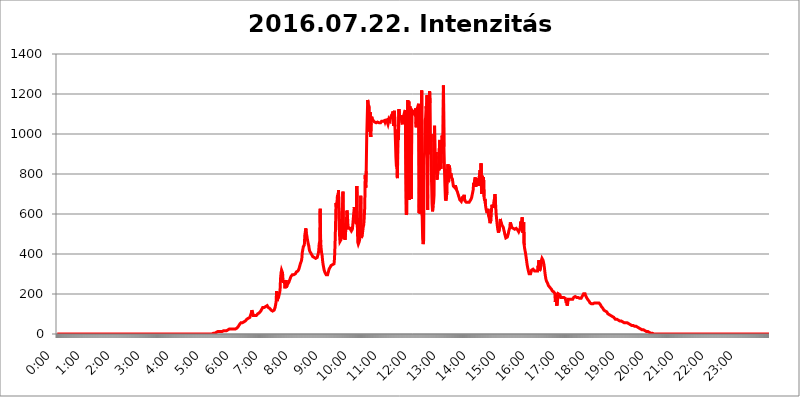
| Category | 2016.07.22. Intenzitás [W/m^2] |
|---|---|
| 0.0 | 0 |
| 0.0006944444444444445 | 0 |
| 0.001388888888888889 | 0 |
| 0.0020833333333333333 | 0 |
| 0.002777777777777778 | 0 |
| 0.003472222222222222 | 0 |
| 0.004166666666666667 | 0 |
| 0.004861111111111111 | 0 |
| 0.005555555555555556 | 0 |
| 0.0062499999999999995 | 0 |
| 0.006944444444444444 | 0 |
| 0.007638888888888889 | 0 |
| 0.008333333333333333 | 0 |
| 0.009027777777777779 | 0 |
| 0.009722222222222222 | 0 |
| 0.010416666666666666 | 0 |
| 0.011111111111111112 | 0 |
| 0.011805555555555555 | 0 |
| 0.012499999999999999 | 0 |
| 0.013194444444444444 | 0 |
| 0.013888888888888888 | 0 |
| 0.014583333333333332 | 0 |
| 0.015277777777777777 | 0 |
| 0.015972222222222224 | 0 |
| 0.016666666666666666 | 0 |
| 0.017361111111111112 | 0 |
| 0.018055555555555557 | 0 |
| 0.01875 | 0 |
| 0.019444444444444445 | 0 |
| 0.02013888888888889 | 0 |
| 0.020833333333333332 | 0 |
| 0.02152777777777778 | 0 |
| 0.022222222222222223 | 0 |
| 0.02291666666666667 | 0 |
| 0.02361111111111111 | 0 |
| 0.024305555555555556 | 0 |
| 0.024999999999999998 | 0 |
| 0.025694444444444447 | 0 |
| 0.02638888888888889 | 0 |
| 0.027083333333333334 | 0 |
| 0.027777777777777776 | 0 |
| 0.02847222222222222 | 0 |
| 0.029166666666666664 | 0 |
| 0.029861111111111113 | 0 |
| 0.030555555555555555 | 0 |
| 0.03125 | 0 |
| 0.03194444444444445 | 0 |
| 0.03263888888888889 | 0 |
| 0.03333333333333333 | 0 |
| 0.034027777777777775 | 0 |
| 0.034722222222222224 | 0 |
| 0.035416666666666666 | 0 |
| 0.036111111111111115 | 0 |
| 0.03680555555555556 | 0 |
| 0.0375 | 0 |
| 0.03819444444444444 | 0 |
| 0.03888888888888889 | 0 |
| 0.03958333333333333 | 0 |
| 0.04027777777777778 | 0 |
| 0.04097222222222222 | 0 |
| 0.041666666666666664 | 0 |
| 0.042361111111111106 | 0 |
| 0.04305555555555556 | 0 |
| 0.043750000000000004 | 0 |
| 0.044444444444444446 | 0 |
| 0.04513888888888889 | 0 |
| 0.04583333333333334 | 0 |
| 0.04652777777777778 | 0 |
| 0.04722222222222222 | 0 |
| 0.04791666666666666 | 0 |
| 0.04861111111111111 | 0 |
| 0.049305555555555554 | 0 |
| 0.049999999999999996 | 0 |
| 0.05069444444444445 | 0 |
| 0.051388888888888894 | 0 |
| 0.052083333333333336 | 0 |
| 0.05277777777777778 | 0 |
| 0.05347222222222222 | 0 |
| 0.05416666666666667 | 0 |
| 0.05486111111111111 | 0 |
| 0.05555555555555555 | 0 |
| 0.05625 | 0 |
| 0.05694444444444444 | 0 |
| 0.057638888888888885 | 0 |
| 0.05833333333333333 | 0 |
| 0.05902777777777778 | 0 |
| 0.059722222222222225 | 0 |
| 0.06041666666666667 | 0 |
| 0.061111111111111116 | 0 |
| 0.06180555555555556 | 0 |
| 0.0625 | 0 |
| 0.06319444444444444 | 0 |
| 0.06388888888888888 | 0 |
| 0.06458333333333334 | 0 |
| 0.06527777777777778 | 0 |
| 0.06597222222222222 | 0 |
| 0.06666666666666667 | 0 |
| 0.06736111111111111 | 0 |
| 0.06805555555555555 | 0 |
| 0.06874999999999999 | 0 |
| 0.06944444444444443 | 0 |
| 0.07013888888888889 | 0 |
| 0.07083333333333333 | 0 |
| 0.07152777777777779 | 0 |
| 0.07222222222222223 | 0 |
| 0.07291666666666667 | 0 |
| 0.07361111111111111 | 0 |
| 0.07430555555555556 | 0 |
| 0.075 | 0 |
| 0.07569444444444444 | 0 |
| 0.0763888888888889 | 0 |
| 0.07708333333333334 | 0 |
| 0.07777777777777778 | 0 |
| 0.07847222222222222 | 0 |
| 0.07916666666666666 | 0 |
| 0.0798611111111111 | 0 |
| 0.08055555555555556 | 0 |
| 0.08125 | 0 |
| 0.08194444444444444 | 0 |
| 0.08263888888888889 | 0 |
| 0.08333333333333333 | 0 |
| 0.08402777777777777 | 0 |
| 0.08472222222222221 | 0 |
| 0.08541666666666665 | 0 |
| 0.08611111111111112 | 0 |
| 0.08680555555555557 | 0 |
| 0.08750000000000001 | 0 |
| 0.08819444444444445 | 0 |
| 0.08888888888888889 | 0 |
| 0.08958333333333333 | 0 |
| 0.09027777777777778 | 0 |
| 0.09097222222222222 | 0 |
| 0.09166666666666667 | 0 |
| 0.09236111111111112 | 0 |
| 0.09305555555555556 | 0 |
| 0.09375 | 0 |
| 0.09444444444444444 | 0 |
| 0.09513888888888888 | 0 |
| 0.09583333333333333 | 0 |
| 0.09652777777777777 | 0 |
| 0.09722222222222222 | 0 |
| 0.09791666666666667 | 0 |
| 0.09861111111111111 | 0 |
| 0.09930555555555555 | 0 |
| 0.09999999999999999 | 0 |
| 0.10069444444444443 | 0 |
| 0.1013888888888889 | 0 |
| 0.10208333333333335 | 0 |
| 0.10277777777777779 | 0 |
| 0.10347222222222223 | 0 |
| 0.10416666666666667 | 0 |
| 0.10486111111111111 | 0 |
| 0.10555555555555556 | 0 |
| 0.10625 | 0 |
| 0.10694444444444444 | 0 |
| 0.1076388888888889 | 0 |
| 0.10833333333333334 | 0 |
| 0.10902777777777778 | 0 |
| 0.10972222222222222 | 0 |
| 0.1111111111111111 | 0 |
| 0.11180555555555556 | 0 |
| 0.11180555555555556 | 0 |
| 0.1125 | 0 |
| 0.11319444444444444 | 0 |
| 0.11388888888888889 | 0 |
| 0.11458333333333333 | 0 |
| 0.11527777777777777 | 0 |
| 0.11597222222222221 | 0 |
| 0.11666666666666665 | 0 |
| 0.1173611111111111 | 0 |
| 0.11805555555555557 | 0 |
| 0.11944444444444445 | 0 |
| 0.12013888888888889 | 0 |
| 0.12083333333333333 | 0 |
| 0.12152777777777778 | 0 |
| 0.12222222222222223 | 0 |
| 0.12291666666666667 | 0 |
| 0.12291666666666667 | 0 |
| 0.12361111111111112 | 0 |
| 0.12430555555555556 | 0 |
| 0.125 | 0 |
| 0.12569444444444444 | 0 |
| 0.12638888888888888 | 0 |
| 0.12708333333333333 | 0 |
| 0.16875 | 0 |
| 0.12847222222222224 | 0 |
| 0.12916666666666668 | 0 |
| 0.12986111111111112 | 0 |
| 0.13055555555555556 | 0 |
| 0.13125 | 0 |
| 0.13194444444444445 | 0 |
| 0.1326388888888889 | 0 |
| 0.13333333333333333 | 0 |
| 0.13402777777777777 | 0 |
| 0.13402777777777777 | 0 |
| 0.13472222222222222 | 0 |
| 0.13541666666666666 | 0 |
| 0.1361111111111111 | 0 |
| 0.13749999999999998 | 0 |
| 0.13819444444444443 | 0 |
| 0.1388888888888889 | 0 |
| 0.13958333333333334 | 0 |
| 0.14027777777777778 | 0 |
| 0.14097222222222222 | 0 |
| 0.14166666666666666 | 0 |
| 0.1423611111111111 | 0 |
| 0.14305555555555557 | 0 |
| 0.14375000000000002 | 0 |
| 0.14444444444444446 | 0 |
| 0.1451388888888889 | 0 |
| 0.1451388888888889 | 0 |
| 0.14652777777777778 | 0 |
| 0.14722222222222223 | 0 |
| 0.14791666666666667 | 0 |
| 0.1486111111111111 | 0 |
| 0.14930555555555555 | 0 |
| 0.15 | 0 |
| 0.15069444444444444 | 0 |
| 0.15138888888888888 | 0 |
| 0.15208333333333332 | 0 |
| 0.15277777777777776 | 0 |
| 0.15347222222222223 | 0 |
| 0.15416666666666667 | 0 |
| 0.15486111111111112 | 0 |
| 0.15555555555555556 | 0 |
| 0.15625 | 0 |
| 0.15694444444444444 | 0 |
| 0.15763888888888888 | 0 |
| 0.15833333333333333 | 0 |
| 0.15902777777777777 | 0 |
| 0.15972222222222224 | 0 |
| 0.16041666666666668 | 0 |
| 0.16111111111111112 | 0 |
| 0.16180555555555556 | 0 |
| 0.1625 | 0 |
| 0.16319444444444445 | 0 |
| 0.1638888888888889 | 0 |
| 0.16458333333333333 | 0 |
| 0.16527777777777777 | 0 |
| 0.16597222222222222 | 0 |
| 0.16666666666666666 | 0 |
| 0.1673611111111111 | 0 |
| 0.16805555555555554 | 0 |
| 0.16874999999999998 | 0 |
| 0.16944444444444443 | 0 |
| 0.17013888888888887 | 0 |
| 0.1708333333333333 | 0 |
| 0.17152777777777775 | 0 |
| 0.17222222222222225 | 0 |
| 0.1729166666666667 | 0 |
| 0.17361111111111113 | 0 |
| 0.17430555555555557 | 0 |
| 0.17500000000000002 | 0 |
| 0.17569444444444446 | 0 |
| 0.1763888888888889 | 0 |
| 0.17708333333333334 | 0 |
| 0.17777777777777778 | 0 |
| 0.17847222222222223 | 0 |
| 0.17916666666666667 | 0 |
| 0.1798611111111111 | 0 |
| 0.18055555555555555 | 0 |
| 0.18125 | 0 |
| 0.18194444444444444 | 0 |
| 0.1826388888888889 | 0 |
| 0.18333333333333335 | 0 |
| 0.1840277777777778 | 0 |
| 0.18472222222222223 | 0 |
| 0.18541666666666667 | 0 |
| 0.18611111111111112 | 0 |
| 0.18680555555555556 | 0 |
| 0.1875 | 0 |
| 0.18819444444444444 | 0 |
| 0.18888888888888888 | 0 |
| 0.18958333333333333 | 0 |
| 0.19027777777777777 | 0 |
| 0.1909722222222222 | 0 |
| 0.19166666666666665 | 0 |
| 0.19236111111111112 | 0 |
| 0.19305555555555554 | 0 |
| 0.19375 | 0 |
| 0.19444444444444445 | 0 |
| 0.1951388888888889 | 0 |
| 0.19583333333333333 | 0 |
| 0.19652777777777777 | 0 |
| 0.19722222222222222 | 0 |
| 0.19791666666666666 | 0 |
| 0.1986111111111111 | 0 |
| 0.19930555555555554 | 0 |
| 0.19999999999999998 | 0 |
| 0.20069444444444443 | 0 |
| 0.20138888888888887 | 0 |
| 0.2020833333333333 | 0 |
| 0.2027777777777778 | 0 |
| 0.2034722222222222 | 0 |
| 0.2041666666666667 | 0 |
| 0.20486111111111113 | 0 |
| 0.20555555555555557 | 0 |
| 0.20625000000000002 | 0 |
| 0.20694444444444446 | 0 |
| 0.2076388888888889 | 0 |
| 0.20833333333333334 | 0 |
| 0.20902777777777778 | 0 |
| 0.20972222222222223 | 0 |
| 0.21041666666666667 | 0 |
| 0.2111111111111111 | 0 |
| 0.21180555555555555 | 0 |
| 0.2125 | 0 |
| 0.21319444444444444 | 0 |
| 0.2138888888888889 | 0 |
| 0.21458333333333335 | 0 |
| 0.2152777777777778 | 0 |
| 0.21597222222222223 | 0 |
| 0.21666666666666667 | 0 |
| 0.21736111111111112 | 0 |
| 0.21805555555555556 | 3.525 |
| 0.21875 | 3.525 |
| 0.21944444444444444 | 3.525 |
| 0.22013888888888888 | 3.525 |
| 0.22083333333333333 | 3.525 |
| 0.22152777777777777 | 3.525 |
| 0.2222222222222222 | 7.887 |
| 0.22291666666666665 | 7.887 |
| 0.2236111111111111 | 7.887 |
| 0.22430555555555556 | 7.887 |
| 0.225 | 12.257 |
| 0.22569444444444445 | 12.257 |
| 0.2263888888888889 | 12.257 |
| 0.22708333333333333 | 12.257 |
| 0.22777777777777777 | 12.257 |
| 0.22847222222222222 | 12.257 |
| 0.22916666666666666 | 12.257 |
| 0.2298611111111111 | 12.257 |
| 0.23055555555555554 | 12.257 |
| 0.23124999999999998 | 12.257 |
| 0.23194444444444443 | 16.636 |
| 0.23263888888888887 | 16.636 |
| 0.2333333333333333 | 16.636 |
| 0.2340277777777778 | 16.636 |
| 0.2347222222222222 | 16.636 |
| 0.2354166666666667 | 16.636 |
| 0.23611111111111113 | 16.636 |
| 0.23680555555555557 | 16.636 |
| 0.23750000000000002 | 16.636 |
| 0.23819444444444446 | 21.024 |
| 0.2388888888888889 | 21.024 |
| 0.23958333333333334 | 21.024 |
| 0.24027777777777778 | 21.024 |
| 0.24097222222222223 | 25.419 |
| 0.24166666666666667 | 25.419 |
| 0.2423611111111111 | 25.419 |
| 0.24305555555555555 | 29.823 |
| 0.24375 | 25.419 |
| 0.24444444444444446 | 25.419 |
| 0.24513888888888888 | 25.419 |
| 0.24583333333333335 | 25.419 |
| 0.2465277777777778 | 25.419 |
| 0.24722222222222223 | 25.419 |
| 0.24791666666666667 | 25.419 |
| 0.24861111111111112 | 25.419 |
| 0.24930555555555556 | 25.419 |
| 0.25 | 25.419 |
| 0.25069444444444444 | 25.419 |
| 0.2513888888888889 | 25.419 |
| 0.2520833333333333 | 29.823 |
| 0.25277777777777777 | 29.823 |
| 0.2534722222222222 | 34.234 |
| 0.25416666666666665 | 38.653 |
| 0.2548611111111111 | 43.079 |
| 0.2555555555555556 | 47.511 |
| 0.25625000000000003 | 47.511 |
| 0.2569444444444445 | 51.951 |
| 0.2576388888888889 | 56.398 |
| 0.25833333333333336 | 56.398 |
| 0.2590277777777778 | 60.85 |
| 0.25972222222222224 | 56.398 |
| 0.2604166666666667 | 60.85 |
| 0.2611111111111111 | 60.85 |
| 0.26180555555555557 | 60.85 |
| 0.2625 | 60.85 |
| 0.26319444444444445 | 60.85 |
| 0.2638888888888889 | 65.31 |
| 0.26458333333333334 | 65.31 |
| 0.2652777777777778 | 69.775 |
| 0.2659722222222222 | 74.246 |
| 0.26666666666666666 | 74.246 |
| 0.2673611111111111 | 78.722 |
| 0.26805555555555555 | 78.722 |
| 0.26875 | 78.722 |
| 0.26944444444444443 | 83.205 |
| 0.2701388888888889 | 83.205 |
| 0.2708333333333333 | 83.205 |
| 0.27152777777777776 | 87.692 |
| 0.2722222222222222 | 105.69 |
| 0.27291666666666664 | 119.235 |
| 0.2736111111111111 | 114.716 |
| 0.2743055555555555 | 101.184 |
| 0.27499999999999997 | 92.184 |
| 0.27569444444444446 | 87.692 |
| 0.27638888888888885 | 92.184 |
| 0.27708333333333335 | 92.184 |
| 0.2777777777777778 | 92.184 |
| 0.27847222222222223 | 92.184 |
| 0.2791666666666667 | 92.184 |
| 0.2798611111111111 | 92.184 |
| 0.28055555555555556 | 96.682 |
| 0.28125 | 101.184 |
| 0.28194444444444444 | 101.184 |
| 0.2826388888888889 | 101.184 |
| 0.2833333333333333 | 105.69 |
| 0.28402777777777777 | 110.201 |
| 0.2847222222222222 | 110.201 |
| 0.28541666666666665 | 114.716 |
| 0.28611111111111115 | 119.235 |
| 0.28680555555555554 | 123.758 |
| 0.28750000000000003 | 128.284 |
| 0.2881944444444445 | 132.814 |
| 0.2888888888888889 | 132.814 |
| 0.28958333333333336 | 132.814 |
| 0.2902777777777778 | 132.814 |
| 0.29097222222222224 | 132.814 |
| 0.2916666666666667 | 132.814 |
| 0.2923611111111111 | 137.347 |
| 0.29305555555555557 | 137.347 |
| 0.29375 | 141.884 |
| 0.29444444444444445 | 141.884 |
| 0.2951388888888889 | 137.347 |
| 0.29583333333333334 | 132.814 |
| 0.2965277777777778 | 132.814 |
| 0.2972222222222222 | 128.284 |
| 0.29791666666666666 | 128.284 |
| 0.2986111111111111 | 128.284 |
| 0.29930555555555555 | 123.758 |
| 0.3 | 119.235 |
| 0.30069444444444443 | 114.716 |
| 0.3013888888888889 | 114.716 |
| 0.3020833333333333 | 114.716 |
| 0.30277777777777776 | 114.716 |
| 0.3034722222222222 | 114.716 |
| 0.30416666666666664 | 119.235 |
| 0.3048611111111111 | 123.758 |
| 0.3055555555555555 | 132.814 |
| 0.30624999999999997 | 146.423 |
| 0.3069444444444444 | 160.056 |
| 0.3076388888888889 | 214.746 |
| 0.30833333333333335 | 164.605 |
| 0.3090277777777778 | 173.709 |
| 0.30972222222222223 | 169.156 |
| 0.3104166666666667 | 182.82 |
| 0.3111111111111111 | 196.497 |
| 0.31180555555555556 | 205.62 |
| 0.3125 | 219.309 |
| 0.31319444444444444 | 278.603 |
| 0.3138888888888889 | 305.898 |
| 0.3145833333333333 | 319.517 |
| 0.31527777777777777 | 314.98 |
| 0.3159722222222222 | 305.898 |
| 0.31666666666666665 | 269.49 |
| 0.31736111111111115 | 255.813 |
| 0.31805555555555554 | 269.49 |
| 0.31875000000000003 | 255.813 |
| 0.3194444444444445 | 228.436 |
| 0.3201388888888889 | 223.873 |
| 0.32083333333333336 | 269.49 |
| 0.3215277777777778 | 233 |
| 0.32222222222222224 | 242.127 |
| 0.3229166666666667 | 246.689 |
| 0.3236111111111111 | 251.251 |
| 0.32430555555555557 | 255.813 |
| 0.325 | 260.373 |
| 0.32569444444444445 | 264.932 |
| 0.3263888888888889 | 274.047 |
| 0.32708333333333334 | 278.603 |
| 0.3277777777777778 | 287.709 |
| 0.3284722222222222 | 292.259 |
| 0.32916666666666666 | 292.259 |
| 0.3298611111111111 | 296.808 |
| 0.33055555555555555 | 296.808 |
| 0.33125 | 296.808 |
| 0.33194444444444443 | 296.808 |
| 0.3326388888888889 | 296.808 |
| 0.3333333333333333 | 296.808 |
| 0.3340277777777778 | 301.354 |
| 0.3347222222222222 | 305.898 |
| 0.3354166666666667 | 310.44 |
| 0.3361111111111111 | 314.98 |
| 0.3368055555555556 | 314.98 |
| 0.33749999999999997 | 314.98 |
| 0.33819444444444446 | 319.517 |
| 0.33888888888888885 | 324.052 |
| 0.33958333333333335 | 333.113 |
| 0.34027777777777773 | 337.639 |
| 0.34097222222222223 | 351.198 |
| 0.3416666666666666 | 355.712 |
| 0.3423611111111111 | 364.728 |
| 0.3430555555555555 | 378.224 |
| 0.34375 | 409.574 |
| 0.3444444444444445 | 422.943 |
| 0.3451388888888889 | 436.27 |
| 0.3458333333333334 | 440.702 |
| 0.34652777777777777 | 445.129 |
| 0.34722222222222227 | 493.475 |
| 0.34791666666666665 | 510.885 |
| 0.34861111111111115 | 528.2 |
| 0.34930555555555554 | 502.192 |
| 0.35000000000000003 | 493.475 |
| 0.3506944444444444 | 475.972 |
| 0.3513888888888889 | 462.786 |
| 0.3520833333333333 | 449.551 |
| 0.3527777777777778 | 440.702 |
| 0.3534722222222222 | 422.943 |
| 0.3541666666666667 | 414.035 |
| 0.3548611111111111 | 409.574 |
| 0.35555555555555557 | 405.108 |
| 0.35625 | 400.638 |
| 0.35694444444444445 | 396.164 |
| 0.3576388888888889 | 391.685 |
| 0.35833333333333334 | 387.202 |
| 0.3590277777777778 | 387.202 |
| 0.3597222222222222 | 387.202 |
| 0.36041666666666666 | 382.715 |
| 0.3611111111111111 | 387.202 |
| 0.36180555555555555 | 378.224 |
| 0.3625 | 378.224 |
| 0.36319444444444443 | 378.224 |
| 0.3638888888888889 | 378.224 |
| 0.3645833333333333 | 382.715 |
| 0.3652777777777778 | 387.202 |
| 0.3659722222222222 | 400.638 |
| 0.3666666666666667 | 414.035 |
| 0.3673611111111111 | 449.551 |
| 0.3680555555555556 | 462.786 |
| 0.36874999999999997 | 625.784 |
| 0.36944444444444446 | 458.38 |
| 0.37013888888888885 | 427.39 |
| 0.37083333333333335 | 405.108 |
| 0.37152777777777773 | 391.685 |
| 0.37222222222222223 | 364.728 |
| 0.3729166666666666 | 346.682 |
| 0.3736111111111111 | 333.113 |
| 0.3743055555555555 | 319.517 |
| 0.375 | 314.98 |
| 0.3756944444444445 | 305.898 |
| 0.3763888888888889 | 301.354 |
| 0.3770833333333334 | 296.808 |
| 0.37777777777777777 | 292.259 |
| 0.37847222222222227 | 292.259 |
| 0.37916666666666665 | 296.808 |
| 0.37986111111111115 | 305.898 |
| 0.38055555555555554 | 314.98 |
| 0.38125000000000003 | 324.052 |
| 0.3819444444444444 | 328.584 |
| 0.3826388888888889 | 333.113 |
| 0.3833333333333333 | 337.639 |
| 0.3840277777777778 | 342.162 |
| 0.3847222222222222 | 346.682 |
| 0.3854166666666667 | 346.682 |
| 0.3861111111111111 | 346.682 |
| 0.38680555555555557 | 342.162 |
| 0.3875 | 342.162 |
| 0.38819444444444445 | 351.198 |
| 0.3888888888888889 | 378.224 |
| 0.38958333333333334 | 445.129 |
| 0.3902777777777778 | 536.82 |
| 0.3909722222222222 | 654.791 |
| 0.39166666666666666 | 629.948 |
| 0.3923611111111111 | 658.909 |
| 0.39305555555555555 | 695.666 |
| 0.39375 | 654.791 |
| 0.39444444444444443 | 719.877 |
| 0.3951388888888889 | 715.858 |
| 0.3958333333333333 | 497.836 |
| 0.3965277777777778 | 462.786 |
| 0.3972222222222222 | 462.786 |
| 0.3979166666666667 | 471.582 |
| 0.3986111111111111 | 489.108 |
| 0.3993055555555556 | 536.82 |
| 0.39999999999999997 | 625.784 |
| 0.40069444444444446 | 711.832 |
| 0.40138888888888885 | 506.542 |
| 0.40208333333333335 | 475.972 |
| 0.40277777777777773 | 553.986 |
| 0.40347222222222223 | 471.582 |
| 0.4041666666666666 | 497.836 |
| 0.4048611111111111 | 528.2 |
| 0.4055555555555555 | 558.261 |
| 0.40625 | 617.436 |
| 0.4069444444444445 | 596.45 |
| 0.4076388888888889 | 549.704 |
| 0.4083333333333334 | 528.2 |
| 0.40902777777777777 | 532.513 |
| 0.40972222222222227 | 532.513 |
| 0.41041666666666665 | 528.2 |
| 0.41111111111111115 | 523.88 |
| 0.41180555555555554 | 528.2 |
| 0.41250000000000003 | 515.223 |
| 0.4131944444444444 | 510.885 |
| 0.4138888888888889 | 523.88 |
| 0.4145833333333333 | 549.704 |
| 0.4152777777777778 | 553.986 |
| 0.4159722222222222 | 609.062 |
| 0.4166666666666667 | 634.105 |
| 0.4173611111111111 | 592.233 |
| 0.41805555555555557 | 634.105 |
| 0.41875 | 558.261 |
| 0.41944444444444445 | 549.704 |
| 0.4201388888888889 | 739.877 |
| 0.42083333333333334 | 545.416 |
| 0.4215277777777778 | 458.38 |
| 0.4222222222222222 | 449.551 |
| 0.42291666666666666 | 445.129 |
| 0.4236111111111111 | 462.786 |
| 0.42430555555555555 | 475.972 |
| 0.425 | 549.704 |
| 0.42569444444444443 | 691.608 |
| 0.4263888888888889 | 480.356 |
| 0.4270833333333333 | 475.972 |
| 0.4277777777777778 | 493.475 |
| 0.4284722222222222 | 515.223 |
| 0.4291666666666667 | 536.82 |
| 0.4298611111111111 | 545.416 |
| 0.4305555555555556 | 579.542 |
| 0.43124999999999997 | 634.105 |
| 0.43194444444444446 | 795.074 |
| 0.43263888888888885 | 731.896 |
| 0.43333333333333335 | 814.519 |
| 0.43402777777777773 | 981.244 |
| 0.43472222222222223 | 984.98 |
| 0.4354166666666666 | 1170.358 |
| 0.4361111111111111 | 1150.946 |
| 0.4368055555555555 | 1143.232 |
| 0.4375 | 1135.543 |
| 0.4381944444444445 | 1011.118 |
| 0.4388888888888889 | 1108.816 |
| 0.4395833333333334 | 984.98 |
| 0.44027777777777777 | 1052.255 |
| 0.44097222222222227 | 1086.097 |
| 0.44166666666666665 | 1078.555 |
| 0.44236111111111115 | 1074.789 |
| 0.44305555555555554 | 1067.267 |
| 0.44375000000000003 | 1071.027 |
| 0.4444444444444444 | 1063.51 |
| 0.4451388888888889 | 1059.756 |
| 0.4458333333333333 | 1059.756 |
| 0.4465277777777778 | 1059.756 |
| 0.4472222222222222 | 1056.004 |
| 0.4479166666666667 | 1059.756 |
| 0.4486111111111111 | 1059.756 |
| 0.44930555555555557 | 1059.756 |
| 0.45 | 1063.51 |
| 0.45069444444444445 | 1059.756 |
| 0.4513888888888889 | 1056.004 |
| 0.45208333333333334 | 1059.756 |
| 0.4527777777777778 | 1059.756 |
| 0.4534722222222222 | 1056.004 |
| 0.45416666666666666 | 1059.756 |
| 0.4548611111111111 | 1063.51 |
| 0.45555555555555555 | 1067.267 |
| 0.45625 | 1067.267 |
| 0.45694444444444443 | 1063.51 |
| 0.4576388888888889 | 1063.51 |
| 0.4583333333333333 | 1067.267 |
| 0.4590277777777778 | 1067.267 |
| 0.4597222222222222 | 1059.756 |
| 0.4604166666666667 | 1067.267 |
| 0.4611111111111111 | 1063.51 |
| 0.4618055555555556 | 1071.027 |
| 0.46249999999999997 | 1071.027 |
| 0.46319444444444446 | 1056.004 |
| 0.46388888888888885 | 1048.508 |
| 0.46458333333333335 | 1059.756 |
| 0.46527777777777773 | 1074.789 |
| 0.46597222222222223 | 1071.027 |
| 0.4666666666666666 | 1067.267 |
| 0.4673611111111111 | 1078.555 |
| 0.4680555555555555 | 1086.097 |
| 0.46875 | 1093.653 |
| 0.4694444444444445 | 1093.653 |
| 0.4701388888888889 | 1101.226 |
| 0.4708333333333334 | 1112.618 |
| 0.47152777777777777 | 1041.019 |
| 0.47222222222222227 | 1097.437 |
| 0.47291666666666665 | 1116.426 |
| 0.47361111111111115 | 1037.277 |
| 0.47430555555555554 | 966.295 |
| 0.47500000000000003 | 883.516 |
| 0.4756944444444444 | 837.682 |
| 0.4763888888888889 | 860.676 |
| 0.4770833333333333 | 779.42 |
| 0.4777777777777778 | 1022.323 |
| 0.4784722222222222 | 970.034 |
| 0.4791666666666667 | 1124.056 |
| 0.4798611111111111 | 1101.226 |
| 0.48055555555555557 | 1071.027 |
| 0.48125 | 1086.097 |
| 0.48194444444444445 | 1093.653 |
| 0.4826388888888889 | 1093.653 |
| 0.48333333333333334 | 1089.873 |
| 0.4840277777777778 | 1048.508 |
| 0.4847222222222222 | 1086.097 |
| 0.48541666666666666 | 1086.097 |
| 0.4861111111111111 | 1093.653 |
| 0.48680555555555555 | 1105.019 |
| 0.4875 | 1108.816 |
| 0.48819444444444443 | 1120.238 |
| 0.4888888888888889 | 1124.056 |
| 0.4895833333333333 | 596.45 |
| 0.4902777777777778 | 604.864 |
| 0.4909722222222222 | 1059.756 |
| 0.4916666666666667 | 1170.358 |
| 0.4923611111111111 | 818.392 |
| 0.4930555555555556 | 1162.571 |
| 0.49374999999999997 | 671.22 |
| 0.49444444444444446 | 1139.384 |
| 0.49513888888888885 | 1135.543 |
| 0.49583333333333335 | 898.668 |
| 0.49652777777777773 | 675.311 |
| 0.49722222222222223 | 1097.437 |
| 0.4979166666666666 | 1116.426 |
| 0.4986111111111111 | 1120.238 |
| 0.4993055555555555 | 1108.816 |
| 0.5 | 1105.019 |
| 0.5006944444444444 | 1101.226 |
| 0.5013888888888889 | 1108.816 |
| 0.5020833333333333 | 1112.618 |
| 0.5027777777777778 | 1127.879 |
| 0.5034722222222222 | 1033.537 |
| 0.5041666666666667 | 1116.426 |
| 0.5048611111111111 | 1127.879 |
| 0.5055555555555555 | 1135.543 |
| 0.50625 | 1139.384 |
| 0.5069444444444444 | 1150.946 |
| 0.5076388888888889 | 604.864 |
| 0.5083333333333333 | 833.834 |
| 0.5090277777777777 | 600.661 |
| 0.5097222222222222 | 621.613 |
| 0.5104166666666666 | 604.864 |
| 0.5111111111111112 | 1217.812 |
| 0.5118055555555555 | 592.233 |
| 0.5125000000000001 | 475.972 |
| 0.5131944444444444 | 449.551 |
| 0.513888888888889 | 467.187 |
| 0.5145833333333333 | 875.918 |
| 0.5152777777777778 | 909.996 |
| 0.5159722222222222 | 1067.267 |
| 0.5166666666666667 | 1082.324 |
| 0.517361111111111 | 1139.384 |
| 0.5180555555555556 | 1116.426 |
| 0.5187499999999999 | 1193.918 |
| 0.5194444444444445 | 621.613 |
| 0.5201388888888888 | 1162.571 |
| 0.5208333333333334 | 1158.689 |
| 0.5215277777777778 | 1059.756 |
| 0.5222222222222223 | 1213.804 |
| 0.5229166666666667 | 1154.814 |
| 0.5236111111111111 | 898.668 |
| 0.5243055555555556 | 999.916 |
| 0.525 | 759.723 |
| 0.5256944444444445 | 650.667 |
| 0.5263888888888889 | 613.252 |
| 0.5270833333333333 | 642.4 |
| 0.5277777777777778 | 654.791 |
| 0.5284722222222222 | 695.666 |
| 0.5291666666666667 | 1041.019 |
| 0.5298611111111111 | 856.855 |
| 0.5305555555555556 | 798.974 |
| 0.53125 | 909.996 |
| 0.5319444444444444 | 810.641 |
| 0.5326388888888889 | 771.559 |
| 0.5333333333333333 | 775.492 |
| 0.5340277777777778 | 775.492 |
| 0.5347222222222222 | 849.199 |
| 0.5354166666666667 | 818.392 |
| 0.5361111111111111 | 962.555 |
| 0.5368055555555555 | 970.034 |
| 0.5375 | 845.365 |
| 0.5381944444444444 | 826.123 |
| 0.5388888888888889 | 917.534 |
| 0.5395833333333333 | 992.448 |
| 0.5402777777777777 | 977.508 |
| 0.5409722222222222 | 917.534 |
| 0.5416666666666666 | 1242.089 |
| 0.5423611111111112 | 936.33 |
| 0.5430555555555555 | 829.981 |
| 0.5437500000000001 | 739.877 |
| 0.5444444444444444 | 675.311 |
| 0.545138888888889 | 667.123 |
| 0.5458333333333333 | 671.22 |
| 0.5465277777777778 | 707.8 |
| 0.5472222222222222 | 806.757 |
| 0.5479166666666667 | 849.199 |
| 0.548611111111111 | 759.723 |
| 0.5493055555555556 | 767.62 |
| 0.5499999999999999 | 841.526 |
| 0.5506944444444445 | 818.392 |
| 0.5513888888888888 | 795.074 |
| 0.5520833333333334 | 802.868 |
| 0.5527777777777778 | 783.342 |
| 0.5534722222222223 | 787.258 |
| 0.5541666666666667 | 775.492 |
| 0.5548611111111111 | 775.492 |
| 0.5555555555555556 | 739.877 |
| 0.55625 | 743.859 |
| 0.5569444444444445 | 735.89 |
| 0.5576388888888889 | 731.896 |
| 0.5583333333333333 | 743.859 |
| 0.5590277777777778 | 743.859 |
| 0.5597222222222222 | 723.889 |
| 0.5604166666666667 | 719.877 |
| 0.5611111111111111 | 711.832 |
| 0.5618055555555556 | 707.8 |
| 0.5625 | 695.666 |
| 0.5631944444444444 | 687.544 |
| 0.5638888888888889 | 679.395 |
| 0.5645833333333333 | 671.22 |
| 0.5652777777777778 | 667.123 |
| 0.5659722222222222 | 667.123 |
| 0.5666666666666667 | 663.019 |
| 0.5673611111111111 | 671.22 |
| 0.5680555555555555 | 671.22 |
| 0.56875 | 687.544 |
| 0.5694444444444444 | 675.311 |
| 0.5701388888888889 | 671.22 |
| 0.5708333333333333 | 695.666 |
| 0.5715277777777777 | 667.123 |
| 0.5722222222222222 | 667.123 |
| 0.5729166666666666 | 663.019 |
| 0.5736111111111112 | 658.909 |
| 0.5743055555555555 | 658.909 |
| 0.5750000000000001 | 658.909 |
| 0.5756944444444444 | 658.909 |
| 0.576388888888889 | 658.909 |
| 0.5770833333333333 | 654.791 |
| 0.5777777777777778 | 658.909 |
| 0.5784722222222222 | 663.019 |
| 0.5791666666666667 | 667.123 |
| 0.579861111111111 | 671.22 |
| 0.5805555555555556 | 675.311 |
| 0.5812499999999999 | 683.473 |
| 0.5819444444444445 | 695.666 |
| 0.5826388888888888 | 707.8 |
| 0.5833333333333334 | 719.877 |
| 0.5840277777777778 | 755.766 |
| 0.5847222222222223 | 747.834 |
| 0.5854166666666667 | 767.62 |
| 0.5861111111111111 | 783.342 |
| 0.5868055555555556 | 735.89 |
| 0.5875 | 779.42 |
| 0.5881944444444445 | 747.834 |
| 0.5888888888888889 | 743.859 |
| 0.5895833333333333 | 743.859 |
| 0.5902777777777778 | 751.803 |
| 0.5909722222222222 | 739.877 |
| 0.5916666666666667 | 743.859 |
| 0.5923611111111111 | 802.868 |
| 0.5930555555555556 | 818.392 |
| 0.59375 | 739.877 |
| 0.5944444444444444 | 853.029 |
| 0.5951388888888889 | 699.717 |
| 0.5958333333333333 | 747.834 |
| 0.5965277777777778 | 791.169 |
| 0.5972222222222222 | 731.896 |
| 0.5979166666666667 | 783.342 |
| 0.5986111111111111 | 687.544 |
| 0.5993055555555555 | 667.123 |
| 0.6 | 675.311 |
| 0.6006944444444444 | 642.4 |
| 0.6013888888888889 | 625.784 |
| 0.6020833333333333 | 625.784 |
| 0.6027777777777777 | 604.864 |
| 0.6034722222222222 | 609.062 |
| 0.6041666666666666 | 625.784 |
| 0.6048611111111112 | 592.233 |
| 0.6055555555555555 | 583.779 |
| 0.6062500000000001 | 571.049 |
| 0.6069444444444444 | 553.986 |
| 0.607638888888889 | 549.704 |
| 0.6083333333333333 | 571.049 |
| 0.6090277777777778 | 621.613 |
| 0.6097222222222222 | 646.537 |
| 0.6104166666666667 | 634.105 |
| 0.611111111111111 | 642.4 |
| 0.6118055555555556 | 629.948 |
| 0.6124999999999999 | 634.105 |
| 0.6131944444444445 | 675.311 |
| 0.6138888888888888 | 699.717 |
| 0.6145833333333334 | 663.019 |
| 0.6152777777777778 | 617.436 |
| 0.6159722222222223 | 583.779 |
| 0.6166666666666667 | 558.261 |
| 0.6173611111111111 | 536.82 |
| 0.6180555555555556 | 519.555 |
| 0.61875 | 506.542 |
| 0.6194444444444445 | 510.885 |
| 0.6201388888888889 | 523.88 |
| 0.6208333333333333 | 558.261 |
| 0.6215277777777778 | 575.299 |
| 0.6222222222222222 | 545.416 |
| 0.6229166666666667 | 553.986 |
| 0.6236111111111111 | 545.416 |
| 0.6243055555555556 | 545.416 |
| 0.625 | 541.121 |
| 0.6256944444444444 | 532.513 |
| 0.6263888888888889 | 519.555 |
| 0.6270833333333333 | 510.885 |
| 0.6277777777777778 | 497.836 |
| 0.6284722222222222 | 489.108 |
| 0.6291666666666667 | 480.356 |
| 0.6298611111111111 | 480.356 |
| 0.6305555555555555 | 480.356 |
| 0.63125 | 484.735 |
| 0.6319444444444444 | 493.475 |
| 0.6326388888888889 | 502.192 |
| 0.6333333333333333 | 515.223 |
| 0.6340277777777777 | 519.555 |
| 0.6347222222222222 | 532.513 |
| 0.6354166666666666 | 558.261 |
| 0.6361111111111112 | 553.986 |
| 0.6368055555555555 | 541.121 |
| 0.6375000000000001 | 532.513 |
| 0.6381944444444444 | 532.513 |
| 0.638888888888889 | 528.2 |
| 0.6395833333333333 | 528.2 |
| 0.6402777777777778 | 523.88 |
| 0.6409722222222222 | 523.88 |
| 0.6416666666666667 | 523.88 |
| 0.642361111111111 | 528.2 |
| 0.6430555555555556 | 528.2 |
| 0.6437499999999999 | 528.2 |
| 0.6444444444444445 | 523.88 |
| 0.6451388888888888 | 528.2 |
| 0.6458333333333334 | 519.555 |
| 0.6465277777777778 | 515.223 |
| 0.6472222222222223 | 510.885 |
| 0.6479166666666667 | 510.885 |
| 0.6486111111111111 | 515.223 |
| 0.6493055555555556 | 528.2 |
| 0.65 | 562.53 |
| 0.6506944444444445 | 545.416 |
| 0.6513888888888889 | 562.53 |
| 0.6520833333333333 | 583.779 |
| 0.6527777777777778 | 506.542 |
| 0.6534722222222222 | 515.223 |
| 0.6541666666666667 | 558.261 |
| 0.6548611111111111 | 445.129 |
| 0.6555555555555556 | 427.39 |
| 0.65625 | 414.035 |
| 0.6569444444444444 | 400.638 |
| 0.6576388888888889 | 382.715 |
| 0.6583333333333333 | 364.728 |
| 0.6590277777777778 | 346.682 |
| 0.6597222222222222 | 333.113 |
| 0.6604166666666667 | 333.113 |
| 0.6611111111111111 | 310.44 |
| 0.6618055555555555 | 301.354 |
| 0.6625 | 296.808 |
| 0.6631944444444444 | 296.808 |
| 0.6638888888888889 | 301.354 |
| 0.6645833333333333 | 310.44 |
| 0.6652777777777777 | 319.517 |
| 0.6659722222222222 | 324.052 |
| 0.6666666666666666 | 324.052 |
| 0.6673611111111111 | 324.052 |
| 0.6680555555555556 | 324.052 |
| 0.6687500000000001 | 324.052 |
| 0.6694444444444444 | 314.98 |
| 0.6701388888888888 | 314.98 |
| 0.6708333333333334 | 314.98 |
| 0.6715277777777778 | 314.98 |
| 0.6722222222222222 | 319.517 |
| 0.6729166666666666 | 319.517 |
| 0.6736111111111112 | 314.98 |
| 0.6743055555555556 | 342.162 |
| 0.6749999999999999 | 333.113 |
| 0.6756944444444444 | 369.23 |
| 0.6763888888888889 | 314.98 |
| 0.6770833333333334 | 314.98 |
| 0.6777777777777777 | 328.584 |
| 0.6784722222222223 | 355.712 |
| 0.6791666666666667 | 369.23 |
| 0.6798611111111111 | 378.224 |
| 0.6805555555555555 | 373.729 |
| 0.68125 | 369.23 |
| 0.6819444444444445 | 360.221 |
| 0.6826388888888889 | 346.682 |
| 0.6833333333333332 | 328.584 |
| 0.6840277777777778 | 305.898 |
| 0.6847222222222222 | 287.709 |
| 0.6854166666666667 | 274.047 |
| 0.686111111111111 | 264.932 |
| 0.6868055555555556 | 260.373 |
| 0.6875 | 255.813 |
| 0.6881944444444444 | 251.251 |
| 0.688888888888889 | 242.127 |
| 0.6895833333333333 | 242.127 |
| 0.6902777777777778 | 237.564 |
| 0.6909722222222222 | 233 |
| 0.6916666666666668 | 233 |
| 0.6923611111111111 | 228.436 |
| 0.6930555555555555 | 223.873 |
| 0.69375 | 219.309 |
| 0.6944444444444445 | 214.746 |
| 0.6951388888888889 | 210.182 |
| 0.6958333333333333 | 210.182 |
| 0.6965277777777777 | 210.182 |
| 0.6972222222222223 | 210.182 |
| 0.6979166666666666 | 201.058 |
| 0.6986111111111111 | 160.056 |
| 0.6993055555555556 | 205.62 |
| 0.7000000000000001 | 201.058 |
| 0.7006944444444444 | 141.884 |
| 0.7013888888888888 | 141.884 |
| 0.7020833333333334 | 182.82 |
| 0.7027777777777778 | 201.058 |
| 0.7034722222222222 | 201.058 |
| 0.7041666666666666 | 205.62 |
| 0.7048611111111112 | 196.497 |
| 0.7055555555555556 | 191.937 |
| 0.7062499999999999 | 182.82 |
| 0.7069444444444444 | 182.82 |
| 0.7076388888888889 | 182.82 |
| 0.7083333333333334 | 182.82 |
| 0.7090277777777777 | 182.82 |
| 0.7097222222222223 | 182.82 |
| 0.7104166666666667 | 182.82 |
| 0.7111111111111111 | 178.264 |
| 0.7118055555555555 | 178.264 |
| 0.7125 | 178.264 |
| 0.7131944444444445 | 173.709 |
| 0.7138888888888889 | 155.509 |
| 0.7145833333333332 | 164.605 |
| 0.7152777777777778 | 141.884 |
| 0.7159722222222222 | 155.509 |
| 0.7166666666666667 | 173.709 |
| 0.717361111111111 | 173.709 |
| 0.7180555555555556 | 173.709 |
| 0.71875 | 173.709 |
| 0.7194444444444444 | 173.709 |
| 0.720138888888889 | 173.709 |
| 0.7208333333333333 | 173.709 |
| 0.7215277777777778 | 173.709 |
| 0.7222222222222222 | 173.709 |
| 0.7229166666666668 | 173.709 |
| 0.7236111111111111 | 178.264 |
| 0.7243055555555555 | 182.82 |
| 0.725 | 187.378 |
| 0.7256944444444445 | 182.82 |
| 0.7263888888888889 | 187.378 |
| 0.7270833333333333 | 182.82 |
| 0.7277777777777777 | 182.82 |
| 0.7284722222222223 | 182.82 |
| 0.7291666666666666 | 182.82 |
| 0.7298611111111111 | 182.82 |
| 0.7305555555555556 | 182.82 |
| 0.7312500000000001 | 178.264 |
| 0.7319444444444444 | 178.264 |
| 0.7326388888888888 | 178.264 |
| 0.7333333333333334 | 178.264 |
| 0.7340277777777778 | 178.264 |
| 0.7347222222222222 | 178.264 |
| 0.7354166666666666 | 182.82 |
| 0.7361111111111112 | 182.82 |
| 0.7368055555555556 | 191.937 |
| 0.7374999999999999 | 196.497 |
| 0.7381944444444444 | 201.058 |
| 0.7388888888888889 | 205.62 |
| 0.7395833333333334 | 205.62 |
| 0.7402777777777777 | 201.058 |
| 0.7409722222222223 | 191.937 |
| 0.7416666666666667 | 187.378 |
| 0.7423611111111111 | 182.82 |
| 0.7430555555555555 | 178.264 |
| 0.74375 | 173.709 |
| 0.7444444444444445 | 169.156 |
| 0.7451388888888889 | 169.156 |
| 0.7458333333333332 | 164.605 |
| 0.7465277777777778 | 160.056 |
| 0.7472222222222222 | 155.509 |
| 0.7479166666666667 | 155.509 |
| 0.748611111111111 | 155.509 |
| 0.7493055555555556 | 150.964 |
| 0.75 | 150.964 |
| 0.7506944444444444 | 150.964 |
| 0.751388888888889 | 150.964 |
| 0.7520833333333333 | 155.509 |
| 0.7527777777777778 | 155.509 |
| 0.7534722222222222 | 155.509 |
| 0.7541666666666668 | 155.509 |
| 0.7548611111111111 | 155.509 |
| 0.7555555555555555 | 155.509 |
| 0.75625 | 155.509 |
| 0.7569444444444445 | 160.056 |
| 0.7576388888888889 | 155.509 |
| 0.7583333333333333 | 160.056 |
| 0.7590277777777777 | 155.509 |
| 0.7597222222222223 | 155.509 |
| 0.7604166666666666 | 155.509 |
| 0.7611111111111111 | 155.509 |
| 0.7618055555555556 | 146.423 |
| 0.7625000000000001 | 146.423 |
| 0.7631944444444444 | 137.347 |
| 0.7638888888888888 | 137.347 |
| 0.7645833333333334 | 132.814 |
| 0.7652777777777778 | 128.284 |
| 0.7659722222222222 | 123.758 |
| 0.7666666666666666 | 119.235 |
| 0.7673611111111112 | 119.235 |
| 0.7680555555555556 | 114.716 |
| 0.7687499999999999 | 114.716 |
| 0.7694444444444444 | 110.201 |
| 0.7701388888888889 | 110.201 |
| 0.7708333333333334 | 110.201 |
| 0.7715277777777777 | 105.69 |
| 0.7722222222222223 | 101.184 |
| 0.7729166666666667 | 101.184 |
| 0.7736111111111111 | 96.682 |
| 0.7743055555555555 | 96.682 |
| 0.775 | 96.682 |
| 0.7756944444444445 | 92.184 |
| 0.7763888888888889 | 92.184 |
| 0.7770833333333332 | 87.692 |
| 0.7777777777777778 | 87.692 |
| 0.7784722222222222 | 87.692 |
| 0.7791666666666667 | 83.205 |
| 0.779861111111111 | 83.205 |
| 0.7805555555555556 | 83.205 |
| 0.78125 | 78.722 |
| 0.7819444444444444 | 78.722 |
| 0.782638888888889 | 74.246 |
| 0.7833333333333333 | 74.246 |
| 0.7840277777777778 | 74.246 |
| 0.7847222222222222 | 74.246 |
| 0.7854166666666668 | 74.246 |
| 0.7861111111111111 | 69.775 |
| 0.7868055555555555 | 69.775 |
| 0.7875 | 69.775 |
| 0.7881944444444445 | 69.775 |
| 0.7888888888888889 | 65.31 |
| 0.7895833333333333 | 65.31 |
| 0.7902777777777777 | 65.31 |
| 0.7909722222222223 | 65.31 |
| 0.7916666666666666 | 65.31 |
| 0.7923611111111111 | 60.85 |
| 0.7930555555555556 | 60.85 |
| 0.7937500000000001 | 60.85 |
| 0.7944444444444444 | 56.398 |
| 0.7951388888888888 | 56.398 |
| 0.7958333333333334 | 56.398 |
| 0.7965277777777778 | 56.398 |
| 0.7972222222222222 | 56.398 |
| 0.7979166666666666 | 56.398 |
| 0.7986111111111112 | 56.398 |
| 0.7993055555555556 | 56.398 |
| 0.7999999999999999 | 51.951 |
| 0.8006944444444444 | 51.951 |
| 0.8013888888888889 | 51.951 |
| 0.8020833333333334 | 51.951 |
| 0.8027777777777777 | 47.511 |
| 0.8034722222222223 | 47.511 |
| 0.8041666666666667 | 47.511 |
| 0.8048611111111111 | 47.511 |
| 0.8055555555555555 | 43.079 |
| 0.80625 | 43.079 |
| 0.8069444444444445 | 43.079 |
| 0.8076388888888889 | 43.079 |
| 0.8083333333333332 | 38.653 |
| 0.8090277777777778 | 38.653 |
| 0.8097222222222222 | 38.653 |
| 0.8104166666666667 | 38.653 |
| 0.811111111111111 | 38.653 |
| 0.8118055555555556 | 38.653 |
| 0.8125 | 34.234 |
| 0.8131944444444444 | 34.234 |
| 0.813888888888889 | 34.234 |
| 0.8145833333333333 | 34.234 |
| 0.8152777777777778 | 29.823 |
| 0.8159722222222222 | 29.823 |
| 0.8166666666666668 | 29.823 |
| 0.8173611111111111 | 29.823 |
| 0.8180555555555555 | 25.419 |
| 0.81875 | 25.419 |
| 0.8194444444444445 | 25.419 |
| 0.8201388888888889 | 21.024 |
| 0.8208333333333333 | 21.024 |
| 0.8215277777777777 | 21.024 |
| 0.8222222222222223 | 21.024 |
| 0.8229166666666666 | 21.024 |
| 0.8236111111111111 | 16.636 |
| 0.8243055555555556 | 16.636 |
| 0.8250000000000001 | 16.636 |
| 0.8256944444444444 | 12.257 |
| 0.8263888888888888 | 12.257 |
| 0.8270833333333334 | 12.257 |
| 0.8277777777777778 | 12.257 |
| 0.8284722222222222 | 12.257 |
| 0.8291666666666666 | 7.887 |
| 0.8298611111111112 | 7.887 |
| 0.8305555555555556 | 7.887 |
| 0.8312499999999999 | 7.887 |
| 0.8319444444444444 | 3.525 |
| 0.8326388888888889 | 3.525 |
| 0.8333333333333334 | 3.525 |
| 0.8340277777777777 | 3.525 |
| 0.8347222222222223 | 3.525 |
| 0.8354166666666667 | 3.525 |
| 0.8361111111111111 | 0 |
| 0.8368055555555555 | 0 |
| 0.8375 | 0 |
| 0.8381944444444445 | 0 |
| 0.8388888888888889 | 0 |
| 0.8395833333333332 | 0 |
| 0.8402777777777778 | 0 |
| 0.8409722222222222 | 0 |
| 0.8416666666666667 | 0 |
| 0.842361111111111 | 0 |
| 0.8430555555555556 | 0 |
| 0.84375 | 0 |
| 0.8444444444444444 | 0 |
| 0.845138888888889 | 0 |
| 0.8458333333333333 | 0 |
| 0.8465277777777778 | 0 |
| 0.8472222222222222 | 0 |
| 0.8479166666666668 | 0 |
| 0.8486111111111111 | 0 |
| 0.8493055555555555 | 0 |
| 0.85 | 0 |
| 0.8506944444444445 | 0 |
| 0.8513888888888889 | 0 |
| 0.8520833333333333 | 0 |
| 0.8527777777777777 | 0 |
| 0.8534722222222223 | 0 |
| 0.8541666666666666 | 0 |
| 0.8548611111111111 | 0 |
| 0.8555555555555556 | 0 |
| 0.8562500000000001 | 0 |
| 0.8569444444444444 | 0 |
| 0.8576388888888888 | 0 |
| 0.8583333333333334 | 0 |
| 0.8590277777777778 | 0 |
| 0.8597222222222222 | 0 |
| 0.8604166666666666 | 0 |
| 0.8611111111111112 | 0 |
| 0.8618055555555556 | 0 |
| 0.8624999999999999 | 0 |
| 0.8631944444444444 | 0 |
| 0.8638888888888889 | 0 |
| 0.8645833333333334 | 0 |
| 0.8652777777777777 | 0 |
| 0.8659722222222223 | 0 |
| 0.8666666666666667 | 0 |
| 0.8673611111111111 | 0 |
| 0.8680555555555555 | 0 |
| 0.86875 | 0 |
| 0.8694444444444445 | 0 |
| 0.8701388888888889 | 0 |
| 0.8708333333333332 | 0 |
| 0.8715277777777778 | 0 |
| 0.8722222222222222 | 0 |
| 0.8729166666666667 | 0 |
| 0.873611111111111 | 0 |
| 0.8743055555555556 | 0 |
| 0.875 | 0 |
| 0.8756944444444444 | 0 |
| 0.876388888888889 | 0 |
| 0.8770833333333333 | 0 |
| 0.8777777777777778 | 0 |
| 0.8784722222222222 | 0 |
| 0.8791666666666668 | 0 |
| 0.8798611111111111 | 0 |
| 0.8805555555555555 | 0 |
| 0.88125 | 0 |
| 0.8819444444444445 | 0 |
| 0.8826388888888889 | 0 |
| 0.8833333333333333 | 0 |
| 0.8840277777777777 | 0 |
| 0.8847222222222223 | 0 |
| 0.8854166666666666 | 0 |
| 0.8861111111111111 | 0 |
| 0.8868055555555556 | 0 |
| 0.8875000000000001 | 0 |
| 0.8881944444444444 | 0 |
| 0.8888888888888888 | 0 |
| 0.8895833333333334 | 0 |
| 0.8902777777777778 | 0 |
| 0.8909722222222222 | 0 |
| 0.8916666666666666 | 0 |
| 0.8923611111111112 | 0 |
| 0.8930555555555556 | 0 |
| 0.8937499999999999 | 0 |
| 0.8944444444444444 | 0 |
| 0.8951388888888889 | 0 |
| 0.8958333333333334 | 0 |
| 0.8965277777777777 | 0 |
| 0.8972222222222223 | 0 |
| 0.8979166666666667 | 0 |
| 0.8986111111111111 | 0 |
| 0.8993055555555555 | 0 |
| 0.9 | 0 |
| 0.9006944444444445 | 0 |
| 0.9013888888888889 | 0 |
| 0.9020833333333332 | 0 |
| 0.9027777777777778 | 0 |
| 0.9034722222222222 | 0 |
| 0.9041666666666667 | 0 |
| 0.904861111111111 | 0 |
| 0.9055555555555556 | 0 |
| 0.90625 | 0 |
| 0.9069444444444444 | 0 |
| 0.907638888888889 | 0 |
| 0.9083333333333333 | 0 |
| 0.9090277777777778 | 0 |
| 0.9097222222222222 | 0 |
| 0.9104166666666668 | 0 |
| 0.9111111111111111 | 0 |
| 0.9118055555555555 | 0 |
| 0.9125 | 0 |
| 0.9131944444444445 | 0 |
| 0.9138888888888889 | 0 |
| 0.9145833333333333 | 0 |
| 0.9152777777777777 | 0 |
| 0.9159722222222223 | 0 |
| 0.9166666666666666 | 0 |
| 0.9173611111111111 | 0 |
| 0.9180555555555556 | 0 |
| 0.9187500000000001 | 0 |
| 0.9194444444444444 | 0 |
| 0.9201388888888888 | 0 |
| 0.9208333333333334 | 0 |
| 0.9215277777777778 | 0 |
| 0.9222222222222222 | 0 |
| 0.9229166666666666 | 0 |
| 0.9236111111111112 | 0 |
| 0.9243055555555556 | 0 |
| 0.9249999999999999 | 0 |
| 0.9256944444444444 | 0 |
| 0.9263888888888889 | 0 |
| 0.9270833333333334 | 0 |
| 0.9277777777777777 | 0 |
| 0.9284722222222223 | 0 |
| 0.9291666666666667 | 0 |
| 0.9298611111111111 | 0 |
| 0.9305555555555555 | 0 |
| 0.93125 | 0 |
| 0.9319444444444445 | 0 |
| 0.9326388888888889 | 0 |
| 0.9333333333333332 | 0 |
| 0.9340277777777778 | 0 |
| 0.9347222222222222 | 0 |
| 0.9354166666666667 | 0 |
| 0.936111111111111 | 0 |
| 0.9368055555555556 | 0 |
| 0.9375 | 0 |
| 0.9381944444444444 | 0 |
| 0.938888888888889 | 0 |
| 0.9395833333333333 | 0 |
| 0.9402777777777778 | 0 |
| 0.9409722222222222 | 0 |
| 0.9416666666666668 | 0 |
| 0.9423611111111111 | 0 |
| 0.9430555555555555 | 0 |
| 0.94375 | 0 |
| 0.9444444444444445 | 0 |
| 0.9451388888888889 | 0 |
| 0.9458333333333333 | 0 |
| 0.9465277777777777 | 0 |
| 0.9472222222222223 | 0 |
| 0.9479166666666666 | 0 |
| 0.9486111111111111 | 0 |
| 0.9493055555555556 | 0 |
| 0.9500000000000001 | 0 |
| 0.9506944444444444 | 0 |
| 0.9513888888888888 | 0 |
| 0.9520833333333334 | 0 |
| 0.9527777777777778 | 0 |
| 0.9534722222222222 | 0 |
| 0.9541666666666666 | 0 |
| 0.9548611111111112 | 0 |
| 0.9555555555555556 | 0 |
| 0.9562499999999999 | 0 |
| 0.9569444444444444 | 0 |
| 0.9576388888888889 | 0 |
| 0.9583333333333334 | 0 |
| 0.9590277777777777 | 0 |
| 0.9597222222222223 | 0 |
| 0.9604166666666667 | 0 |
| 0.9611111111111111 | 0 |
| 0.9618055555555555 | 0 |
| 0.9625 | 0 |
| 0.9631944444444445 | 0 |
| 0.9638888888888889 | 0 |
| 0.9645833333333332 | 0 |
| 0.9652777777777778 | 0 |
| 0.9659722222222222 | 0 |
| 0.9666666666666667 | 0 |
| 0.967361111111111 | 0 |
| 0.9680555555555556 | 0 |
| 0.96875 | 0 |
| 0.9694444444444444 | 0 |
| 0.970138888888889 | 0 |
| 0.9708333333333333 | 0 |
| 0.9715277777777778 | 0 |
| 0.9722222222222222 | 0 |
| 0.9729166666666668 | 0 |
| 0.9736111111111111 | 0 |
| 0.9743055555555555 | 0 |
| 0.975 | 0 |
| 0.9756944444444445 | 0 |
| 0.9763888888888889 | 0 |
| 0.9770833333333333 | 0 |
| 0.9777777777777777 | 0 |
| 0.9784722222222223 | 0 |
| 0.9791666666666666 | 0 |
| 0.9798611111111111 | 0 |
| 0.9805555555555556 | 0 |
| 0.9812500000000001 | 0 |
| 0.9819444444444444 | 0 |
| 0.9826388888888888 | 0 |
| 0.9833333333333334 | 0 |
| 0.9840277777777778 | 0 |
| 0.9847222222222222 | 0 |
| 0.9854166666666666 | 0 |
| 0.9861111111111112 | 0 |
| 0.9868055555555556 | 0 |
| 0.9874999999999999 | 0 |
| 0.9881944444444444 | 0 |
| 0.9888888888888889 | 0 |
| 0.9895833333333334 | 0 |
| 0.9902777777777777 | 0 |
| 0.9909722222222223 | 0 |
| 0.9916666666666667 | 0 |
| 0.9923611111111111 | 0 |
| 0.9930555555555555 | 0 |
| 0.99375 | 0 |
| 0.9944444444444445 | 0 |
| 0.9951388888888889 | 0 |
| 0.9958333333333332 | 0 |
| 0.9965277777777778 | 0 |
| 0.9972222222222222 | 0 |
| 0.9979166666666667 | 0 |
| 0.998611111111111 | 0 |
| 0.9993055555555556 | 0 |